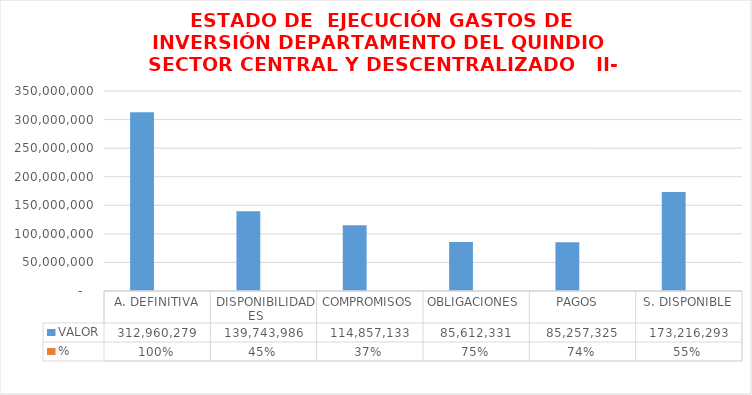
| Category | VALOR  | % |
|---|---|---|
| A. DEFINITIVA | 312960278.828 | 1 |
| DISPONIBILIDADES    | 139743985.595 | 0.447 |
| COMPROMISOS   | 114857133.188 | 0.367 |
| OBLIGACIONES   | 85612330.703 | 0.745 |
| PAGOS   | 85257325.288 | 0.742 |
| S. DISPONIBLE | 173216293.234 | 0.553 |